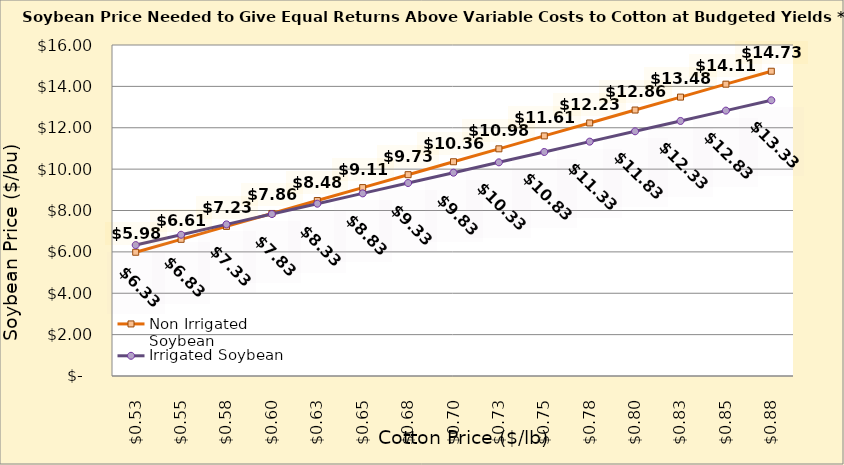
| Category | Non Irrigated Soybean | Irrigated Soybean |
|---|---|---|
| 0.5249999999999998 | 5.981 | 6.328 |
| 0.5499999999999998 | 6.606 | 6.828 |
| 0.5749999999999998 | 7.231 | 7.328 |
| 0.5999999999999999 | 7.856 | 7.828 |
| 0.6249999999999999 | 8.481 | 8.328 |
| 0.6499999999999999 | 9.106 | 8.828 |
| 0.6749999999999999 | 9.731 | 9.328 |
| 0.7 | 10.356 | 9.828 |
| 0.725 | 10.981 | 10.328 |
| 0.75 | 11.606 | 10.828 |
| 0.775 | 12.231 | 11.328 |
| 0.8 | 12.856 | 11.828 |
| 0.8250000000000001 | 13.481 | 12.328 |
| 0.8500000000000001 | 14.106 | 12.828 |
| 0.8750000000000001 | 14.731 | 13.328 |